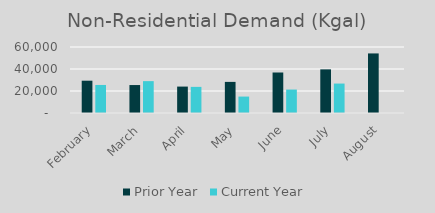
| Category | Prior Year | Current Year |
|---|---|---|
| February | 29366 | 25488 |
| March | 25412 | 28967 |
| April | 24018 | 23746 |
| May | 28279 | 14933 |
| June | 36817 | 21309 |
| July | 39671 | 26764 |
| August | 54156 | 0 |